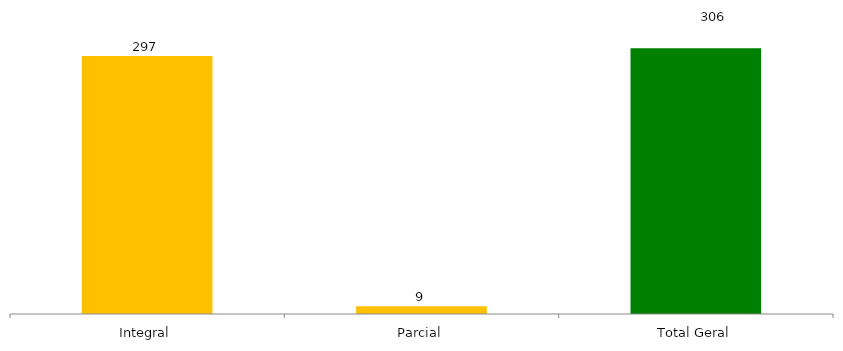
| Category | Categoria/Ano |
|---|---|
| Integral | 297 |
| Parcial | 9 |
| Total Geral | 306 |